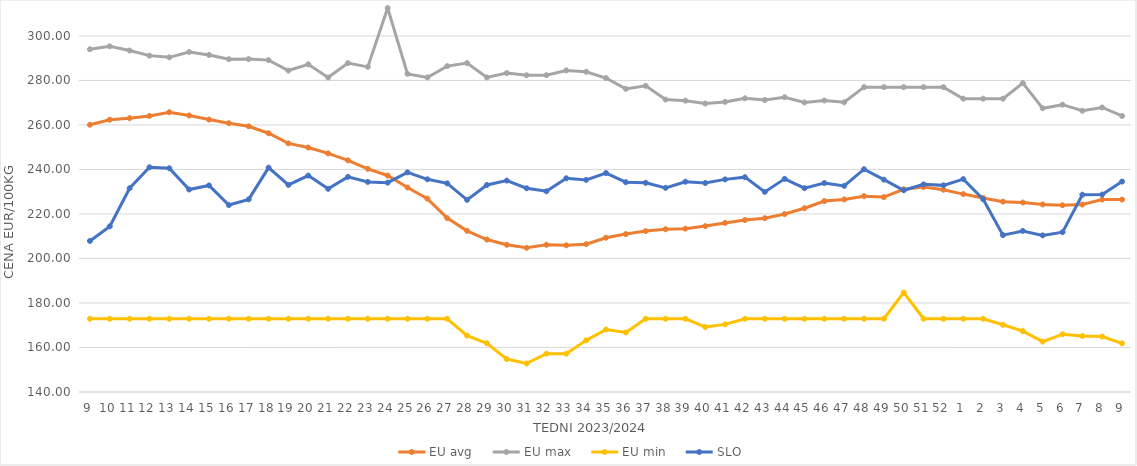
| Category | EU avg | EU max | EU min | SLO |
|---|---|---|---|---|
| 9.0 | 260.066 | 294.02 | 172.91 | 207.87 |
| 10.0 | 262.352 | 295.33 | 172.91 | 214.42 |
| 11.0 | 263.049 | 293.44 | 172.91 | 231.56 |
| 12.0 | 264.068 | 291.15 | 172.91 | 240.97 |
| 13.0 | 265.73 | 290.38 | 172.91 | 240.55 |
| 14.0 | 264.262 | 292.763 | 172.91 | 230.99 |
| 15.0 | 262.411 | 291.46 | 172.91 | 232.82 |
| 16.0 | 260.77 | 289.56 | 172.91 | 224 |
| 17.0 | 259.395 | 289.61 | 172.91 | 226.57 |
| 18.0 | 256.275 | 289.13 | 172.91 | 240.83 |
| 19.0 | 251.716 | 284.45 | 172.91 | 233.05 |
| 20.0 | 249.836 | 287.26 | 172.91 | 237.25 |
| 21.0 | 247.212 | 281.33 | 172.91 | 231.3 |
| 22.0 | 244.103 | 287.77 | 172.91 | 236.67 |
| 23.0 | 240.279 | 286.1 | 172.91 | 234.39 |
| 24.0 | 237.289 | 312.54 | 172.91 | 234.08 |
| 25.0 | 231.895 | 282.95 | 172.91 | 238.69 |
| 26.0 | 226.903 | 281.34 | 172.91 | 235.57 |
| 27.0 | 218.126 | 286.43 | 172.91 | 233.75 |
| 28.0 | 212.406 | 287.8 | 165.32 | 226.35 |
| 29.0 | 208.504 | 281.37 | 161.87 | 233.03 |
| 30.0 | 206.149 | 283.3 | 154.8 | 235 |
| 31.0 | 204.79 | 282.32 | 152.83 | 231.55 |
| 32.0 | 206.16 | 282.36 | 157.23 | 230.2 |
| 33.0 | 205.917 | 284.5 | 157.23 | 236.04 |
| 34.0 | 206.436 | 283.9 | 163.21 | 235.32 |
| 35.0 | 209.326 | 281.09 | 168.085 | 238.39 |
| 36.0 | 210.957 | 276.21 | 166.745 | 234.27 |
| 37.0 | 212.325 | 277.59 | 172.91 | 234 |
| 38.0 | 213.132 | 271.4 | 172.91 | 231.74 |
| 39.0 | 213.398 | 270.91 | 172.91 | 234.5 |
| 40.0 | 214.548 | 269.62 | 169.209 | 233.92 |
| 41.0 | 215.966 | 270.36 | 170.387 | 235.54 |
| 42.0 | 217.294 | 271.99 | 172.91 | 236.54 |
| 43.0 | 218.091 | 271.22 | 172.91 | 229.92 |
| 44.0 | 219.965 | 272.45 | 172.91 | 235.77 |
| 45.0 | 222.584 | 270.09 | 172.91 | 231.6 |
| 46.0 | 225.795 | 270.99 | 172.91 | 233.89 |
| 47.0 | 226.547 | 270.18 | 172.91 | 232.62 |
| 48.0 | 227.993 | 276.99 | 172.91 | 240.11 |
| 49.0 | 227.575 | 276.99 | 172.91 | 235.41 |
| 50.0 | 231.099 | 276.99 | 184.72 | 230.65 |
| 51.0 | 232.088 | 276.99 | 172.91 | 233.3 |
| 52.0 | 230.884 | 276.99 | 172.91 | 232.85 |
| 1.0 | 228.928 | 271.8 | 172.91 | 235.66 |
| 2.0 | 227.213 | 271.8 | 172.91 | 226.65 |
| 3.0 | 225.533 | 271.8 | 170.2 | 210.5 |
| 4.0 | 225.142 | 278.81 | 167.37 | 212.37 |
| 5.0 | 224.291 | 267.49 | 162.66 | 210.38 |
| 6.0 | 223.931 | 269.11 | 165.95 | 211.82 |
| 7.0 | 224.248 | 266.38 | 165.18 | 228.66 |
| 8.0 | 226.503 | 267.85 | 164.92 | 228.73 |
| 9.0 | 226.48 | 264.03 | 161.84 | 234.57 |